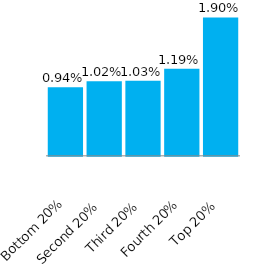
| Category | Series 0 |
|---|---|
| Bottom 20% | 0.009 |
| Second 20% | 0.01 |
| Third 20% | 0.01 |
| Fourth 20% | 0.012 |
| Top 20% | 0.019 |